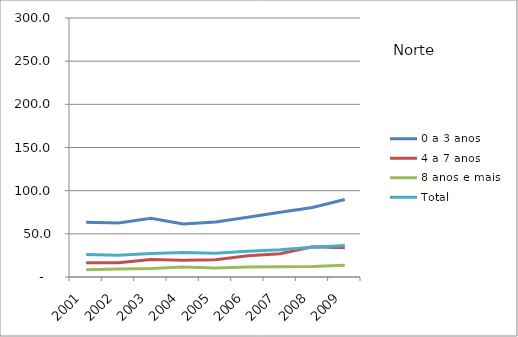
| Category | 0 a 3 anos | 4 a 7 anos | 8 anos e mais | Total |
|---|---|---|---|---|
| 2001.0 | 63.5 | 16.6 | 8.5 | 26.1 |
| 2002.0 | 62.6 | 16.4 | 9.4 | 25.2 |
| 2003.0 | 68.1 | 20.2 | 9.8 | 27.3 |
| 2004.0 | 61.3 | 19.4 | 11.5 | 28.3 |
| 2005.0 | 63.8 | 20.1 | 10.3 | 27.6 |
| 2006.0 | 69.1 | 24.7 | 11.5 | 29.9 |
| 2007.0 | 75.1 | 27 | 12 | 31.7 |
| 2008.0 | 80.5 | 35 | 12.2 | 34.4 |
| 2009.0 | 89.8 | 33.9 | 13.7 | 36.5 |